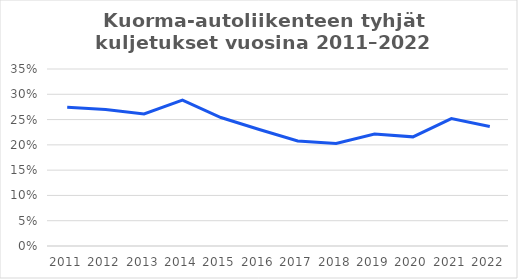
| Category | Tyhjien osuus kaikista kuljetuksista |
|---|---|
| 2011.0 | 0.274 |
| 2012.0 | 0.27 |
| 2013.0 | 0.261 |
| 2014.0 | 0.288 |
| 2015.0 | 0.254 |
| 2016.0 | 0.23 |
| 2017.0 | 0.208 |
| 2018.0 | 0.203 |
| 2019.0 | 0.221 |
| 2020.0 | 0.216 |
| 2021.0 | 0.252 |
| 2022.0 | 0.236 |